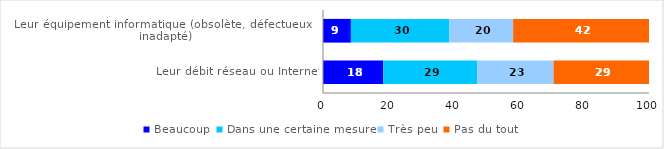
| Category | Beaucoup | Dans une certaine mesure | Très peu | Pas du tout |
|---|---|---|---|---|
| Leur débit réseau ou Internet | 18.457 | 28.901 | 23.358 | 29.285 |
| Leur équipement informatique (obsolète, défectueux ou inadapté) | 8.55 | 30.236 | 19.532 | 41.681 |